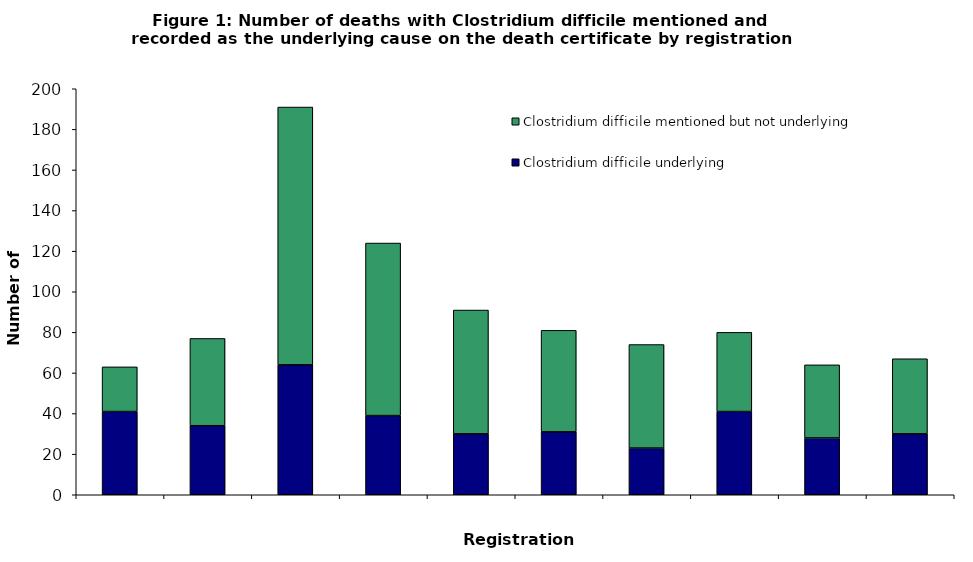
| Category | Clostridium difficile underlying | Clostridium difficile mentioned but not underlying |
|---|---|---|
| 2006.0 | 41 | 22 |
| 2007.0 | 34 | 43 |
| 2008.0 | 64 | 127 |
| 2009.0 | 39 | 85 |
| 2010.0 | 30 | 61 |
| 2011.0 | 31 | 50 |
| 2012.0 | 23 | 51 |
| 2013.0 | 41 | 39 |
| 2014.0 | 28 | 36 |
| 2015.0 | 30 | 37 |